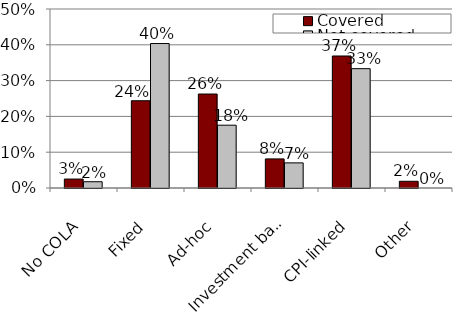
| Category | Covered | Not covered |
|---|---|---|
| No COLA | 0.025 | 0.018 |
| Fixed | 0.244 | 0.404 |
| Ad-hoc | 0.262 | 0.175 |
| Investment based | 0.081 | 0.07 |
| CPI-linked | 0.369 | 0.333 |
| Other | 0.019 | 0 |